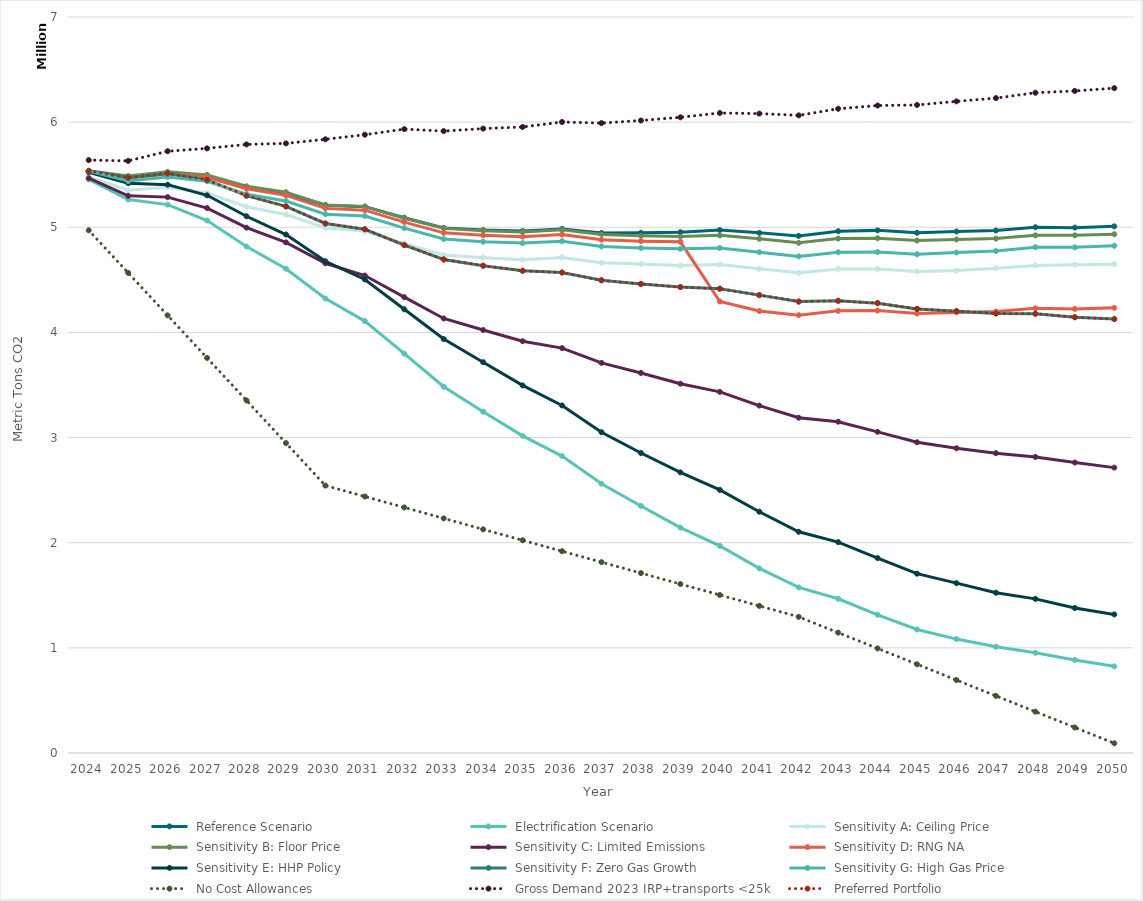
| Category | Series 0 | Series 1 | Series 2 | Series 3 | Series 4 | Series 5 | Series 6 | Series 7 | Series 8 | Series 9 | Series 10 | Series 11 |
|---|---|---|---|---|---|---|---|---|---|---|---|---|
| 2024.0 | 5535516.723 | 5454827.337 | 5478296.975 | 5537450.739 | 5466726.738 | 5535516.723 | 5523526.37 | 5536239.263 | 5535439.816 | 4971392.403 | 5639040.278 | 5536239.263 |
| 2025.0 | 5471919.544 | 5264165.59 | 5351893.273 | 5487572.892 | 5299182.444 | 5469457.969 | 5419206.633 | 5471919.545 | 5439735.128 | 4566744.184 | 5631456.37 | 5471919.545 |
| 2026.0 | 5511962.047 | 5215516.488 | 5380628.551 | 5527477.221 | 5286890.112 | 5507656.366 | 5405279.146 | 5511962.044 | 5477639.051 | 4162095.965 | 5723261.055 | 5511962.044 |
| 2027.0 | 5483091.973 | 5064241.956 | 5325589.726 | 5498047.999 | 5183043.879 | 5476469.321 | 5304216.943 | 5450311.823 | 5438078.472 | 3757447.747 | 5750626.188 | 5450311.823 |
| 2028.0 | 5384187.415 | 4817156.061 | 5195807.211 | 5390261.414 | 4996543.284 | 5366872.341 | 5104750.894 | 5300830.818 | 5314601.624 | 3352799.528 | 5788211.242 | 5300830.818 |
| 2029.0 | 5324081.945 | 4605920.642 | 5121030.768 | 5334102.518 | 4856667.461 | 5303630.412 | 4931190.017 | 5198511.701 | 5250085.582 | 2948151.309 | 5798021.116 | 5198511.701 |
| 2030.0 | 5210269.618 | 4322219.981 | 4994816.199 | 5212157.584 | 4657500.127 | 5179830.714 | 4676761.521 | 5036073.746 | 5124966.368 | 2543503.09 | 5836843.893 | 5036073.746 |
| 2031.0 | 5196362.68 | 4107836.923 | 4962255.018 | 5197123.587 | 4541235.438 | 5162881.88 | 4504069.006 | 4981398.877 | 5106652.389 | 2439450.691 | 5880558.017 | 4981398.877 |
| 2032.0 | 5091268.084 | 3797773.689 | 4846436.886 | 5085717.412 | 4335155.449 | 5049570.727 | 4219956.404 | 4830463.953 | 4991984.13 | 2335398.292 | 5933578.115 | 4830463.953 |
| 2033.0 | 4994330.084 | 3484140.916 | 4736292.226 | 4990460.335 | 4132824.7 | 4947197.747 | 3936890.05 | 4693957.024 | 4888262.625 | 2231345.893 | 5914995.346 | 4693957.024 |
| 2034.0 | 4973617.143 | 3246152.914 | 4710439.469 | 4967849.792 | 4022579.741 | 4923404.464 | 3717082.342 | 4634267.804 | 4863142.382 | 2127293.493 | 5938638.453 | 4634267.804 |
| 2035.0 | 4963785.053 | 3015868.033 | 4691302.287 | 4955737.753 | 3916401.679 | 4910982.05 | 3496134.492 | 4586588.587 | 4849440.212 | 2023241.094 | 5954073.221 | 4586588.587 |
| 2036.0 | 4984489.125 | 2823824.157 | 4713626.274 | 4975642.928 | 3851115.602 | 4930585.333 | 3305309.465 | 4569602.53 | 4867766.718 | 1919188.695 | 6001429.197 | 4569602.53 |
| 2037.0 | 4945861.626 | 2560429.905 | 4662257.058 | 4932515.877 | 3710303.73 | 4881859.307 | 3050990.873 | 4495577.69 | 4817713.088 | 1815136.296 | 5990979.443 | 4495577.69 |
| 2038.0 | 4947333.802 | 2349375.394 | 4650752.568 | 4919385.222 | 3614623.616 | 4868337.732 | 2853468.334 | 4461061.555 | 4802866.355 | 1711083.897 | 6015635.825 | 4461061.555 |
| 2039.0 | 4953668.92 | 2143507.789 | 4635599.787 | 4913144.394 | 3512648.841 | 4861714.623 | 2668966.104 | 4431560.499 | 4794869.067 | 1607031.498 | 6046108.24 | 4431560.499 |
| 2040.0 | 4974135.698 | 1969407.442 | 4646760.906 | 4923220.646 | 3434465.037 | 4293956.61 | 2502273.385 | 4415807.669 | 4803208.961 | 1502979.099 | 6086955.841 | 4415807.669 |
| 2041.0 | 4947029.154 | 1756495.018 | 4604592.726 | 4890439.736 | 3304351.752 | 4203126.323 | 2294736.449 | 4354799.41 | 4763455.526 | 1398926.699 | 6081405.563 | 4354799.41 |
| 2042.0 | 4918070.366 | 1574511.192 | 4567381.91 | 4852055.353 | 3188609.152 | 4164532.196 | 2103955.055 | 4293800.779 | 4723391.262 | 1294874.3 | 6064545.47 | 4293800.779 |
| 2043.0 | 4962976.283 | 1466843.775 | 4604001.684 | 4892741.426 | 3151018.13 | 4205007.31 | 2005642.778 | 4300627.786 | 4762398.817 | 1144576.39 | 6127186.776 | 4300627.786 |
| 2044.0 | 4970609.585 | 1314486.581 | 4602656.08 | 4896051.282 | 3054599.21 | 4208085.763 | 1853749.166 | 4278249.747 | 4763966.165 | 994278.481 | 6158252.768 | 4278249.747 |
| 2045.0 | 4947514.789 | 1174335.479 | 4579370.768 | 4873763.616 | 2955242.089 | 4180375.416 | 1705469.366 | 4223612.877 | 4743551.62 | 843980.571 | 6163122.634 | 4223612.877 |
| 2046.0 | 4959818.347 | 1083349.647 | 4588140.918 | 4884227.782 | 2898344.536 | 4190690.418 | 1615339.871 | 4202562.794 | 4760427.486 | 693682.661 | 6197699.921 | 4202562.794 |
| 2047.0 | 4969480.413 | 1009944.833 | 4609671.526 | 4892366.141 | 2851942.897 | 4198686.159 | 1524175.392 | 4180122.597 | 4774301.648 | 543384.751 | 6228837.459 | 4180122.597 |
| 2048.0 | 5000646.611 | 952803.358 | 4637160.37 | 4923240.93 | 2816092.172 | 4229428.084 | 1465856.514 | 4178072.273 | 4810397.032 | 393086.841 | 6279465.407 | 4178072.273 |
| 2049.0 | 4996752.915 | 884374.125 | 4643473.053 | 4923168.644 | 2762723.488 | 4223804.39 | 1378966.295 | 4144636.136 | 4809549.363 | 242788.931 | 6296833.904 | 4144636.136 |
| 2050.0 | 5008726.26 | 824143.442 | 4649338.576 | 4933769.5 | 2714110.53 | 4233939.863 | 1318023.28 | 4127024.587 | 4823988.42 | 92491.021 | 6323367.955 | 4127024.587 |